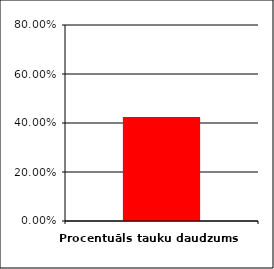
| Category | Series 0 |
|---|---|
| 0 | 0.424 |